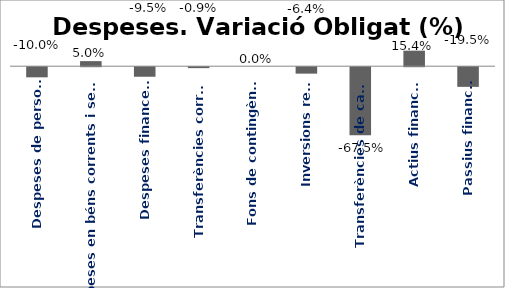
| Category | Series 0 |
|---|---|
| Despeses de personal | -0.1 |
| Despeses en béns corrents i serveis | 0.05 |
| Despeses financeres | -0.095 |
| Transferències corrents | -0.009 |
| Fons de contingència | 0 |
| Inversions reals | -0.064 |
| Transferències de capital | -0.675 |
| Actius financers | 0.154 |
| Passius financers | -0.195 |